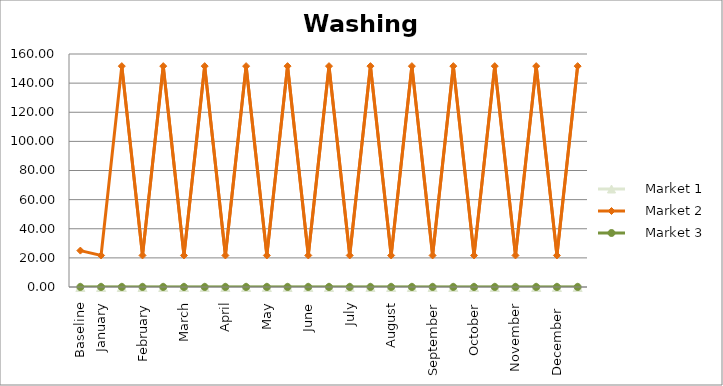
| Category |     Market 1 |     Market 2 |     Market 3 |
|---|---|---|---|
| Baseline | 0 | 25 | 0 |
| January | 0 | 21.667 | 0 |
|  | 0 | 151.667 | 0 |
| February | 0 | 21.667 | 0 |
|  | 0 | 151.667 | 0 |
| March | 0 | 21.667 | 0 |
|  | 0 | 151.667 | 0 |
| April | 0 | 21.667 | 0 |
|  | 0 | 151.667 | 0 |
| May | 0 | 21.667 | 0 |
|  | 0 | 151.667 | 0 |
| June | 0 | 21.667 | 0 |
|  | 0 | 151.667 | 0 |
| July | 0 | 21.667 | 0 |
|  | 0 | 151.667 | 0 |
| August | 0 | 21.667 | 0 |
|  | 0 | 151.667 | 0 |
| September | 0 | 21.667 | 0 |
|  | 0 | 151.667 | 0 |
| October | 0 | 21.667 | 0 |
|  | 0 | 151.667 | 0 |
| November | 0 | 21.667 | 0 |
|  | 0 | 151.667 | 0 |
| December  | 0 | 21.667 | 0 |